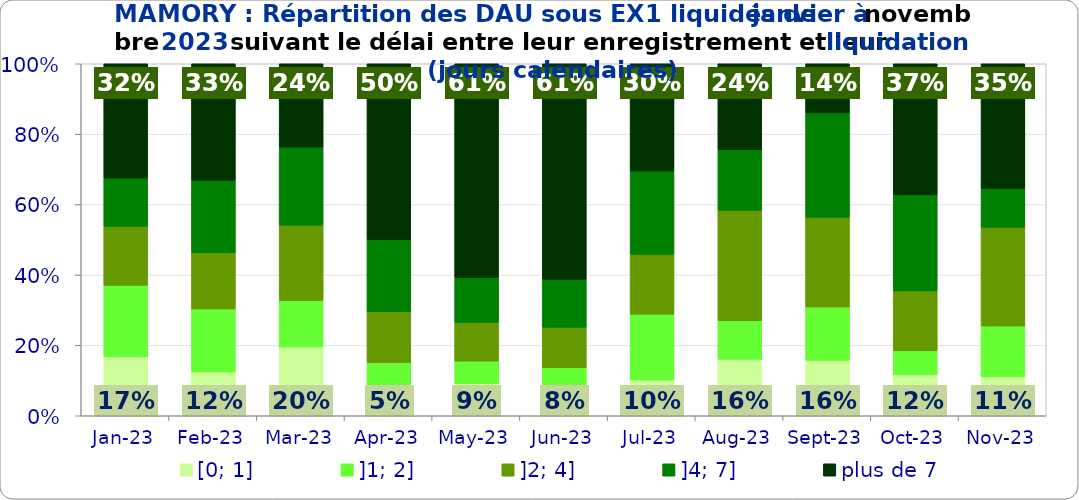
| Category | [0; 1] | ]1; 2] | ]2; 4] | ]4; 7] | plus de 7 |
|---|---|---|---|---|---|
| 2023-01-01 | 0.168 | 0.203 | 0.168 | 0.137 | 0.325 |
| 2023-02-01 | 0.125 | 0.179 | 0.16 | 0.206 | 0.331 |
| 2023-03-01 | 0.195 | 0.132 | 0.214 | 0.222 | 0.237 |
| 2023-04-01 | 0.045 | 0.106 | 0.144 | 0.205 | 0.5 |
| 2023-05-01 | 0.091 | 0.064 | 0.11 | 0.128 | 0.607 |
| 2023-06-01 | 0.078 | 0.059 | 0.115 | 0.137 | 0.612 |
| 2023-07-01 | 0.102 | 0.187 | 0.17 | 0.236 | 0.305 |
| 2023-08-01 | 0.161 | 0.109 | 0.314 | 0.172 | 0.245 |
| 2023-09-01 | 0.158 | 0.152 | 0.255 | 0.297 | 0.139 |
| 2023-10-01 | 0.117 | 0.067 | 0.17 | 0.273 | 0.372 |
| 2023-11-01 | 0.11 | 0.144 | 0.28 | 0.11 | 0.354 |